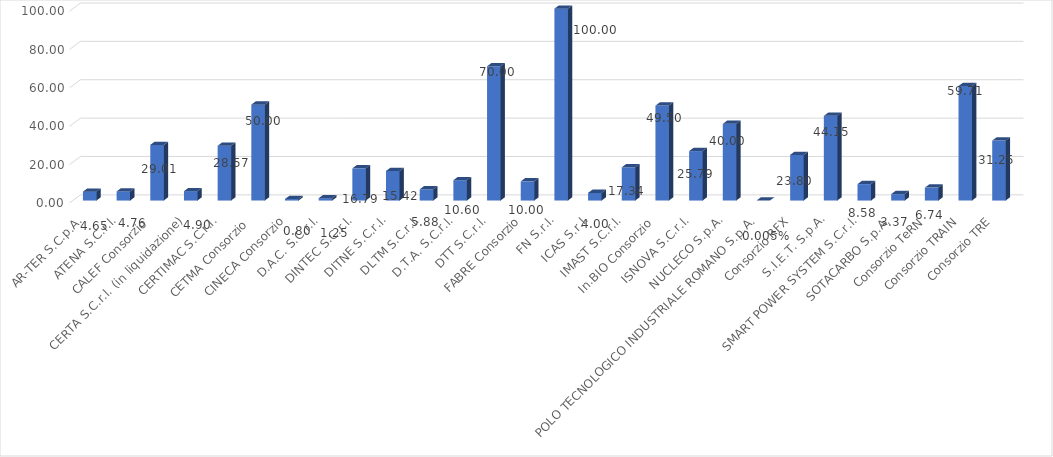
| Category | Series 0 |
|---|---|
| AR-TER S.C.p.A. | 4.65 |
| ATENA S.C.r.l. | 4.76 |
| CALEF Consorzio  | 29.01 |
| CERTA S.C.r.l. (in liquidazione) | 4.9 |
| CERTIMAC S.C.r.l. | 28.57 |
| CETMA Consorzio  | 50 |
| CINECA Consorzio | 0.8 |
| D.A.C. S.C.r.l. | 1.25 |
| DINTEC S.C.r.l. | 16.79 |
| DITNE S.C.r.l. | 15.42 |
| DLTM S.C.r.l. | 5.88 |
| D.T.A. S.C.r.l. | 10.6 |
| DTT S.C.r.l. | 70 |
| FABRE Consorzio | 10 |
| FN S.r.l. | 100 |
| ICAS S.r.l. | 4 |
| IMAST S.C.r.l. | 17.34 |
| In.BIO Consorzio  | 49.5 |
| ISNOVA S.C.r.l. | 25.79 |
| NUCLECO S.p.A. | 40 |
| POLO TECNOLOGICO INDUSTRIALE ROMANO S.p.A. | 0 |
| Consorzio RFX | 23.8 |
| S.I.E.T. S.p.A. | 44.15 |
| SMART POWER SYSTEM S.C.r.l. | 8.58 |
| SOTACARBO S.p.A. | 3.37 |
| Consorzio TeRN | 6.74 |
| Consorzio TRAIN | 59.71 |
| Consorzio TRE | 31.25 |